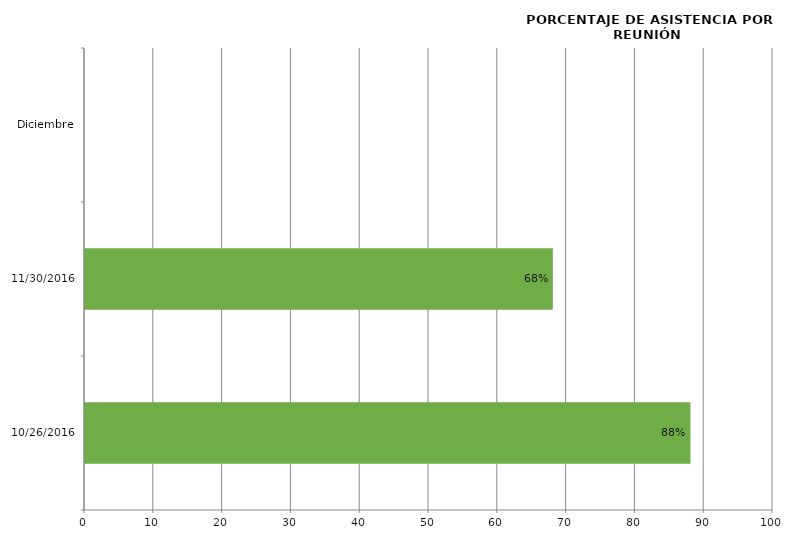
| Category | Series 0 |
|---|---|
| 26/10/2016 | 88 |
| 30/11/2016 | 68 |
| Diciembre | 0 |